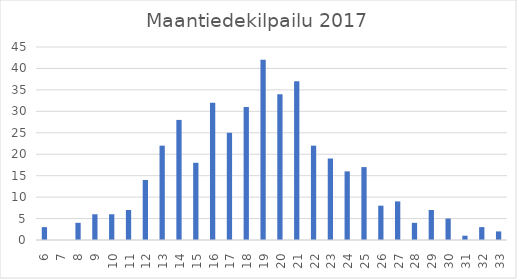
| Category | Series 0 |
|---|---|
| 6.0 | 3 |
| 7.0 | 0 |
| 8.0 | 4 |
| 9.0 | 6 |
| 10.0 | 6 |
| 11.0 | 7 |
| 12.0 | 14 |
| 13.0 | 22 |
| 14.0 | 28 |
| 15.0 | 18 |
| 16.0 | 32 |
| 17.0 | 25 |
| 18.0 | 31 |
| 19.0 | 42 |
| 20.0 | 34 |
| 21.0 | 37 |
| 22.0 | 22 |
| 23.0 | 19 |
| 24.0 | 16 |
| 25.0 | 17 |
| 26.0 | 8 |
| 27.0 | 9 |
| 28.0 | 4 |
| 29.0 | 7 |
| 30.0 | 5 |
| 31.0 | 1 |
| 32.0 | 3 |
| 33.0 | 2 |